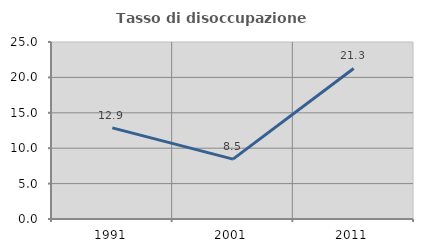
| Category | Tasso di disoccupazione giovanile  |
|---|---|
| 1991.0 | 12.867 |
| 2001.0 | 8.452 |
| 2011.0 | 21.266 |